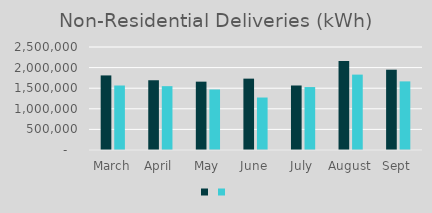
| Category | Series 1 | Series 0 |
|---|---|---|
| March | 1810164 | 1565360 |
| April | 1693101 | 1549578 |
| May | 1658799 | 1468467 |
| June | 1732026 | 1273660 |
| July | 1565715 | 1527956 |
| August | 2157982 | 1829758 |
| Sept | 1948950 | 1665239 |